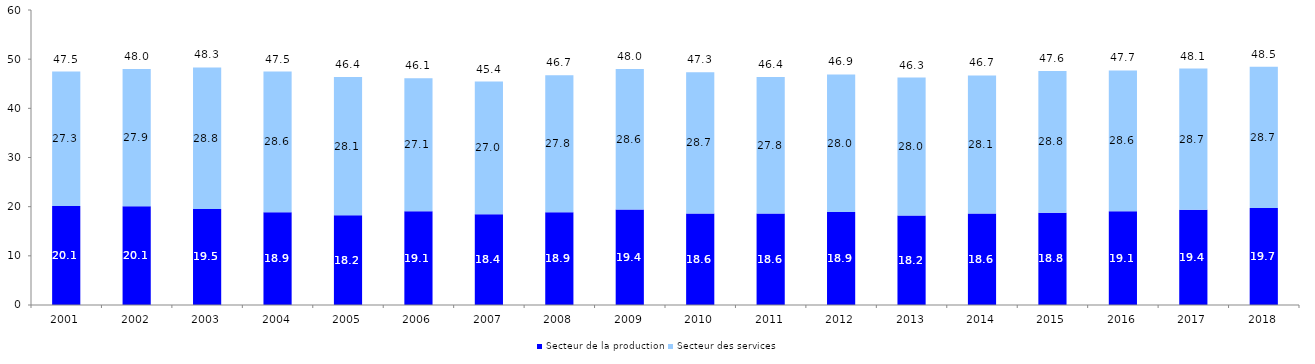
| Category | Secteur de la production | Secteur des services |
|---|---|---|
| 2001.0 | 20.139 | 27.339 |
| 2002.0 | 20.101 | 27.886 |
| 2003.0 | 19.535 | 28.776 |
| 2004.0 | 18.881 | 28.607 |
| 2005.0 | 18.237 | 28.137 |
| 2006.0 | 19.05 | 27.053 |
| 2007.0 | 18.436 | 27.005 |
| 2008.0 | 18.88 | 27.834 |
| 2009.0 | 19.404 | 28.58 |
| 2010.0 | 18.619 | 28.712 |
| 2011.0 | 18.592 | 27.769 |
| 2012.0 | 18.924 | 27.979 |
| 2013.0 | 18.218 | 28.046 |
| 2014.0 | 18.617 | 28.062 |
| 2015.0 | 18.787 | 28.829 |
| 2016.0 | 19.056 | 28.644 |
| 2017.0 | 19.382 | 28.71 |
| 2018.0 | 19.735 | 28.72 |